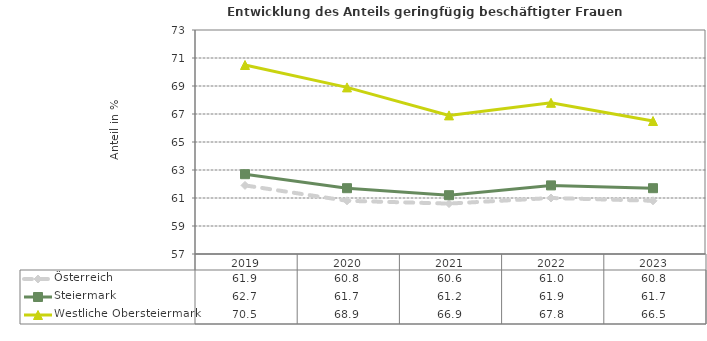
| Category | Österreich | Steiermark | Westliche Obersteiermark |
|---|---|---|---|
| 2023.0 | 60.8 | 61.7 | 66.5 |
| 2022.0 | 61 | 61.9 | 67.8 |
| 2021.0 | 60.6 | 61.2 | 66.9 |
| 2020.0 | 60.8 | 61.7 | 68.9 |
| 2019.0 | 61.9 | 62.7 | 70.5 |